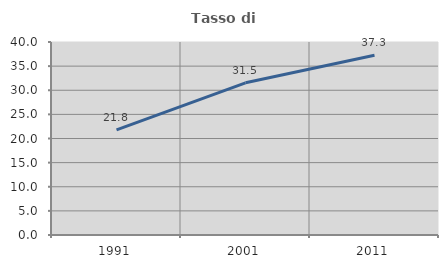
| Category | Tasso di occupazione   |
|---|---|
| 1991.0 | 21.799 |
| 2001.0 | 31.54 |
| 2011.0 | 37.255 |